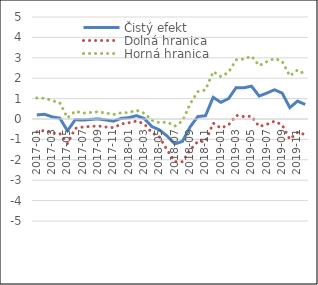
| Category | Čistý efekt | Dolná hranica | Horná hranica |
|---|---|---|---|
| 2017-01 | 0.2 | -0.631 | 1.031 |
| 2017-02 | 0.231 | -0.559 | 1.02 |
| 2017-03 | 0.104 | -0.694 | 0.902 |
| 2017-04 | 0.04 | -0.711 | 0.792 |
| 2017-05 | -0.576 | -1.206 | 0.053 |
| 2017-06 | -0.038 | -0.46 | 0.385 |
| 2017-07 | -0.055 | -0.393 | 0.284 |
| 2017-08 | -0.022 | -0.364 | 0.319 |
| 2017-09 | 0.006 | -0.341 | 0.354 |
| 2017-10 | -0.049 | -0.393 | 0.296 |
| 2017-11 | -0.103 | -0.425 | 0.218 |
| 2017-12 | 0.03 | -0.243 | 0.303 |
| 2018-01 | 0.065 | -0.185 | 0.315 |
| 2018-02 | 0.164 | -0.102 | 0.429 |
| 2018-03 | 0.025 | -0.235 | 0.285 |
| 2018-04 | -0.368 | -0.672 | -0.064 |
| 2018-05 | -0.535 | -0.886 | -0.184 |
| 2018-06 | -0.835 | -1.518 | -0.152 |
| 2018-07 | -1.22 | -2.09 | -0.35 |
| 2018-08 | -1.097 | -2.096 | -0.097 |
| 2018-09 | -0.383 | -1.514 | 0.749 |
| 2018-10 | 0.12 | -1.102 | 1.341 |
| 2018-11 | 0.16 | -1.105 | 1.425 |
| 2018-12 | 1.061 | -0.202 | 2.324 |
| 2019-01 | 0.817 | -0.446 | 2.079 |
| 2019-02 | 0.998 | -0.296 | 2.292 |
| 2019-03 | 1.538 | 0.176 | 2.9 |
| 2019-04 | 1.529 | 0.12 | 2.939 |
| 2019-05 | 1.609 | 0.137 | 3.082 |
| 2019-06 | 1.124 | -0.369 | 2.618 |
| 2019-07 | 1.271 | -0.263 | 2.806 |
| 2019-08 | 1.432 | -0.107 | 2.971 |
| 2019-09 | 1.27 | -0.289 | 2.83 |
| 2019-10 | 0.557 | -0.997 | 2.11 |
| 2019-11 | 0.877 | -0.651 | 2.405 |
| 2019-12 | 0.713 | -0.765 | 2.192 |